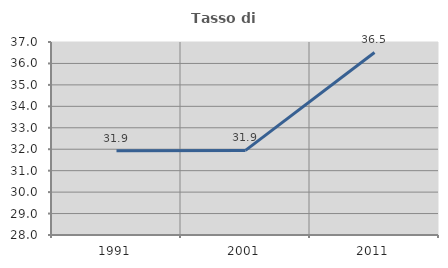
| Category | Tasso di occupazione   |
|---|---|
| 1991.0 | 31.931 |
| 2001.0 | 31.946 |
| 2011.0 | 36.513 |